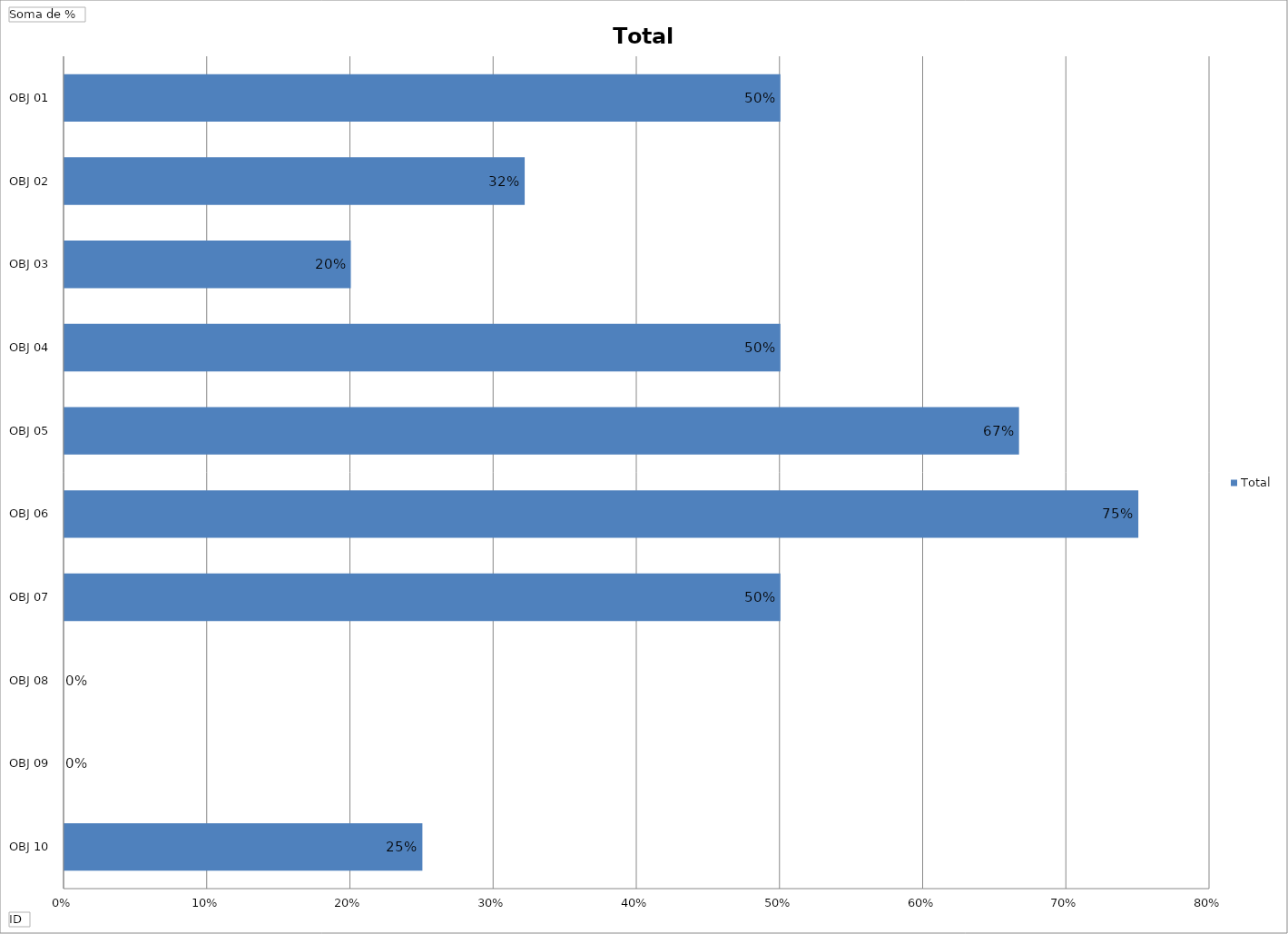
| Category | Total |
|---|---|
| OBJ 10 | 0.25 |
| OBJ 09 | 0 |
| OBJ 08 | 0 |
| OBJ 07 | 0.5 |
| OBJ 06 | 0.75 |
| OBJ 05 | 0.667 |
| OBJ 04 | 0.5 |
| OBJ 03 | 0.2 |
| OBJ 02 | 0.321 |
| OBJ 01 | 0.5 |